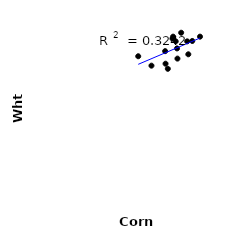
| Category | Series 0 |
|---|---|
| 100.7 | 38.2 |
| 138.6 | 37.6 |
| 113.5 | 35.8 |
| 127.1 | 36.3 |
| 126.7 | 39.5 |
| 134.4 | 43.2 |
| 133.8 | 42.7 |
| 136.9 | 42 |
| 138.2 | 40.2 |
| 129.3 | 35 |
| 142.2 | 44.2 |
| 160.4 | 43.2 |
| 148.0 | 42 |
| 149.1 | 38.7 |
| 152.9 | 42.1 |